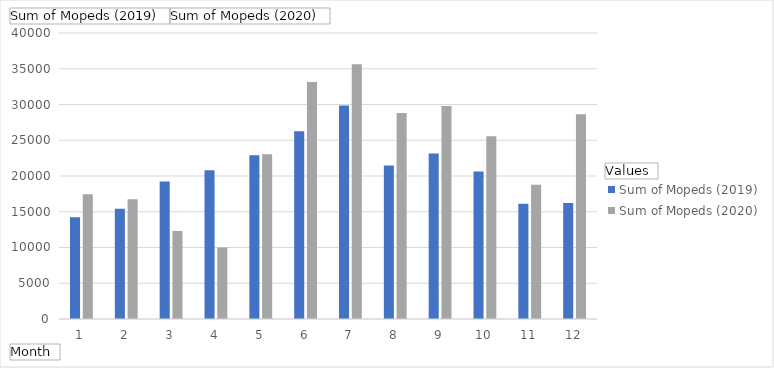
| Category | Sum of Mopeds (2019) | Sum of Mopeds (2020) |
|---|---|---|
| 1 | 14235 | 17454 |
| 2 | 15411 | 16733 |
| 3 | 19237 | 12291 |
| 4 | 20813 | 10008 |
| 5 | 22897 | 23034 |
| 6 | 26257 | 33133 |
| 7 | 29873 | 35622 |
| 8 | 21480 | 28821 |
| 9 | 23162 | 29776 |
| 10 | 20633 | 25543 |
| 11 | 16118 | 18790 |
| 12 | 16229 | 28636 |